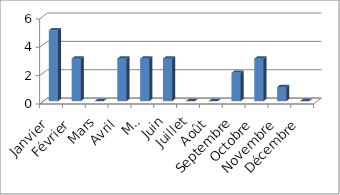
| Category | Doc |
|---|---|
| Janvier | 5 |
| Février | 3 |
| Mars | 0 |
| Avril | 3 |
| Mai | 3 |
| Juin | 3 |
| Juillet | 0 |
| Août | 0 |
| Septembre | 2 |
| Octobre | 3 |
| Novembre | 1 |
| Décembre | 0 |